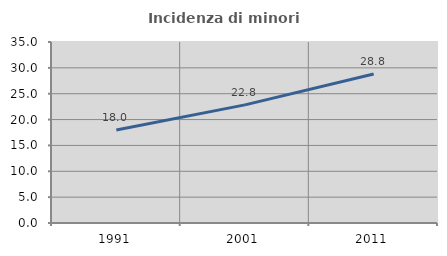
| Category | Incidenza di minori stranieri |
|---|---|
| 1991.0 | 18 |
| 2001.0 | 22.845 |
| 2011.0 | 28.823 |